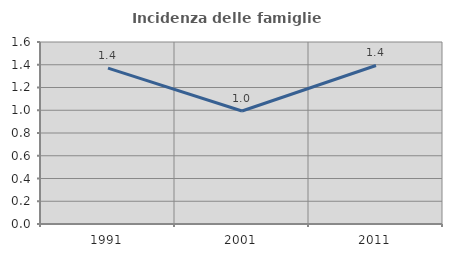
| Category | Incidenza delle famiglie numerose |
|---|---|
| 1991.0 | 1.37 |
| 2001.0 | 0.993 |
| 2011.0 | 1.394 |